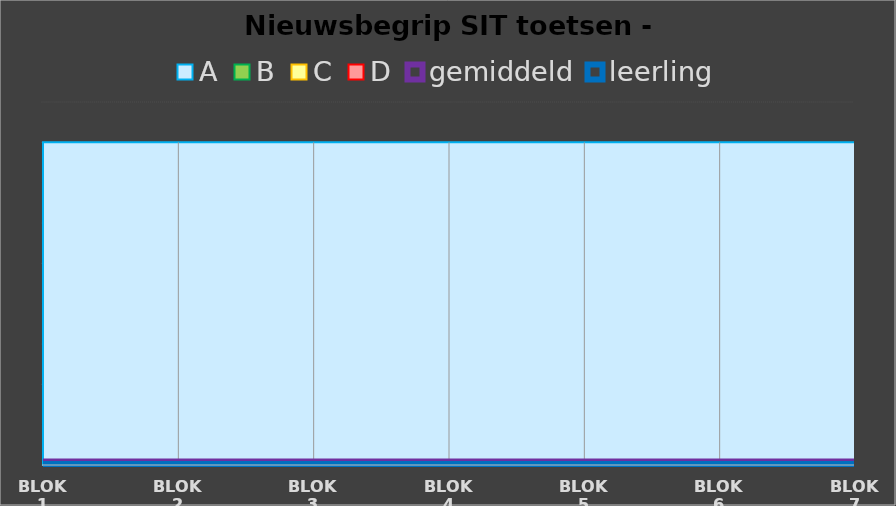
| Category | A | B | C | D | gemiddeld | leerling |
|---|---|---|---|---|---|---|
| blok 1 | 40 | 0 | 0 | 0 | 0 | 0 |
| blok 2 | 40 | 0 | 0 | 0 | 0 | 0 |
| blok 3 | 40 | 0 | 0 | 0 | 0 | 0 |
| blok 4 | 40 | 0 | 0 | 0 | 0 | 0 |
| blok 5 | 40 | 0 | 0 | 0 | 0 | 0 |
| blok 6 | 40 | 0 | 0 | 0 | 0 | 0 |
| blok 7 | 40 | 0 | 0 | 0 | 0 | 0 |